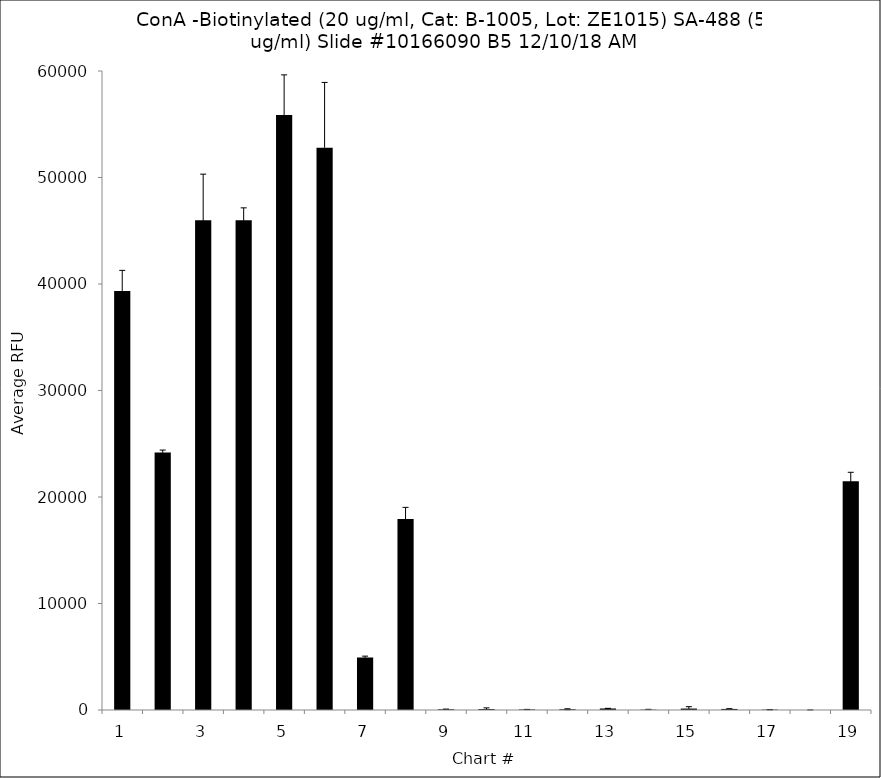
| Category | Series 0 |
|---|---|
| 1.0 | 39351.25 |
| 2.0 | 24187.75 |
| 3.0 | 45981.75 |
| 4.0 | 45977.75 |
| 5.0 | 55872.75 |
| 6.0 | 52803.5 |
| 7.0 | 4933.5 |
| 8.0 | 17932.25 |
| 9.0 | 68 |
| 10.0 | 86 |
| 11.0 | 49.25 |
| 12.0 | 70.5 |
| 13.0 | 140.5 |
| 14.0 | 29 |
| 15.0 | 135.5 |
| 16.0 | 100.75 |
| 17.0 | 33 |
| 18.0 | 1.75 |
| 19.0 | 21474.25 |